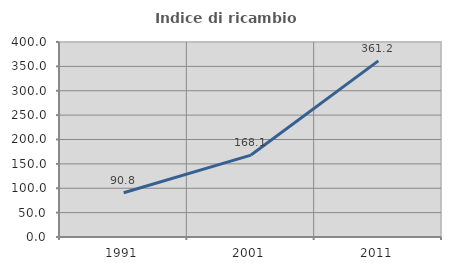
| Category | Indice di ricambio occupazionale  |
|---|---|
| 1991.0 | 90.826 |
| 2001.0 | 168.072 |
| 2011.0 | 361.207 |